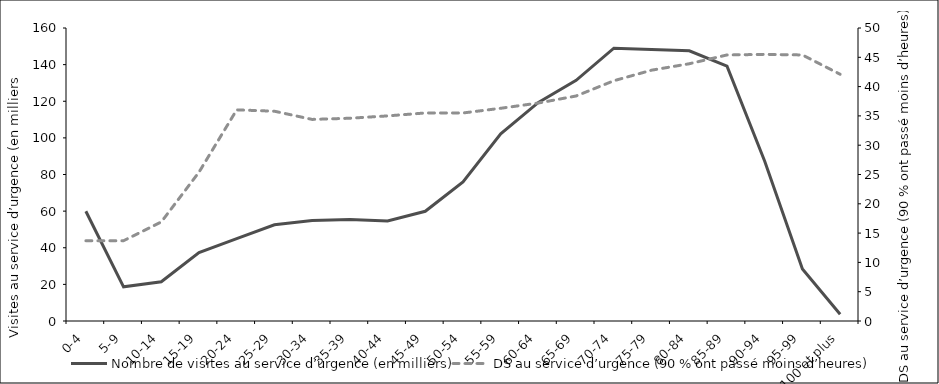
| Category | Nombre de visites au service d’urgence (en milliers) |
|---|---|
| 0-4 | 59.944 |
| 5-9 | 18.662 |
| 10-14 | 21.463 |
| 15-19 | 37.326 |
| 20-24 | 44.994 |
| 25-29 | 52.511 |
| 30-34 | 54.94 |
| 35-39 | 55.415 |
| 40-44 | 54.665 |
| 45-49 | 59.915 |
| 50-54 | 75.924 |
| 55-59 | 102.195 |
| 60-64 | 119.381 |
| 65-69 | 131.417 |
| 70-74 | 148.958 |
| 75-79 | 148.308 |
| 80-84 | 147.57 |
| 85-89 | 139.139 |
| 90-94 | 87.223 |
| 95-99 | 28.367 |
| 100 et plus | 3.704 |